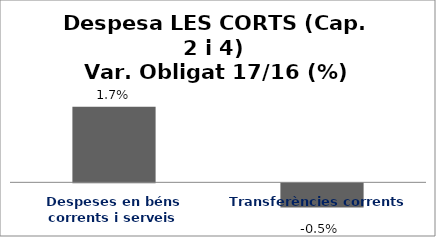
| Category | Series 0 |
|---|---|
| Despeses en béns corrents i serveis | 0.017 |
| Transferències corrents | -0.005 |